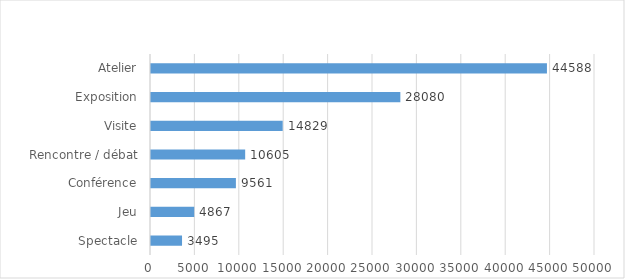
| Category | Frequentation |
|---|---|
| Spectacle | 3495 |
| Jeu | 4867 |
| Conférence | 9561 |
| Rencontre / débat | 10605 |
| Visite | 14829 |
| Exposition | 28080 |
| Atelier | 44588 |